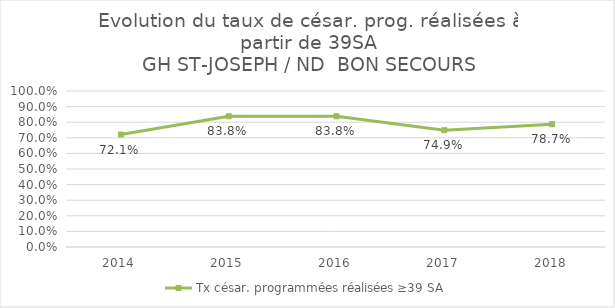
| Category | Tx césar. programmées réalisées ≥39 SA |
|---|---|
| 2014 | 0.721 |
| 2015 | 0.838 |
| 2016 | 0.838 |
| 2017 | 0.749 |
| 2018 | 0.787 |